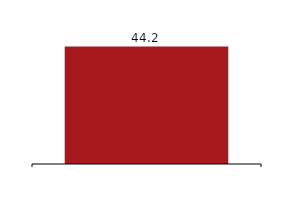
| Category | Total operating income |
|---|---|
|  | 44189 |